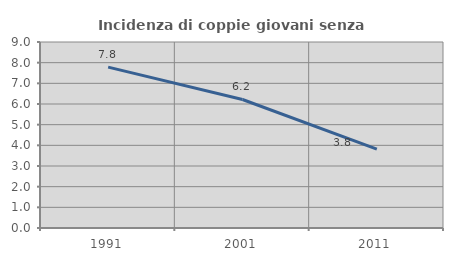
| Category | Incidenza di coppie giovani senza figli |
|---|---|
| 1991.0 | 7.785 |
| 2001.0 | 6.218 |
| 2011.0 | 3.812 |